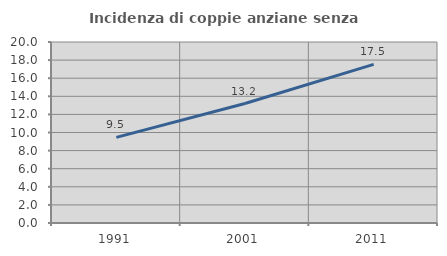
| Category | Incidenza di coppie anziane senza figli  |
|---|---|
| 1991.0 | 9.463 |
| 2001.0 | 13.201 |
| 2011.0 | 17.529 |